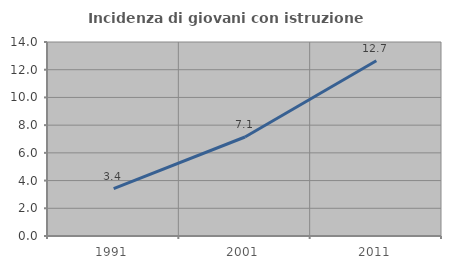
| Category | Incidenza di giovani con istruzione universitaria |
|---|---|
| 1991.0 | 3.412 |
| 2001.0 | 7.143 |
| 2011.0 | 12.651 |